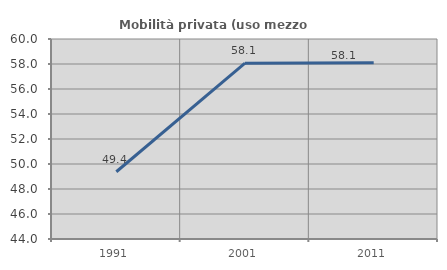
| Category | Mobilità privata (uso mezzo privato) |
|---|---|
| 1991.0 | 49.381 |
| 2001.0 | 58.063 |
| 2011.0 | 58.108 |